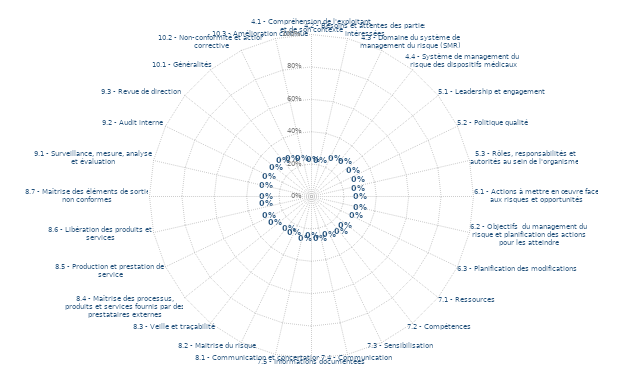
| Category | Sélectionnez | Résultats |
|---|---|---|
| 4.1 - Compréhension de l'exploitant et de son contexte | 0 | 0 |
| 4.2 - Besoins et attentes des parties intéressées | 0 | 0 |
| 4.3 - Domaine du système de management du risque (SMR) | 0 | 0 |
| 4.4 - Système de management du risque des dispositifs médicaux | 0 | 0 |
| 5.1 - Leadership et engagement | 0 | 0 |
| 5.2 - Politique qualité | 0 | 0 |
| 5.3 - Rôles, responsabilités et autorités au sein de l'organisme | 0 | 0 |
| 6.1 - Actions à mettre en œuvre face aux risques et opportunités | 0 | 0 |
| 6.2 - Objectifs  du management du risque et planification des actions pour les atteindre | 0 | 0 |
| 6.3 - Planification des modifications | 0 | 0 |
| 7.1 - Ressources | 0 | 0 |
| 7.2 - Compétences | 0 | 0 |
| 7.3 - Sensibilisation | 0 | 0 |
| 7.4 - Communication | 0 | 0 |
| 7.5 - Informations documentées | 0 | 0 |
| 8.1 - Communication et concertation | 0 | 0 |
| 8.2 - Maitrise du risque | 0 | 0 |
| 8.3 - Veille et traçabilité | 0 | 0 |
| 8.4 - Maîtrise des processus, produits et services fournis par des prestataires externes | 0 | 0 |
| 8.5 - Production et prestation de service | 0 | 0 |
| 8.6 - Libération des produits et services | 0 | 0 |
| 8.7 - Maîtrise des éléments de sortie non conformes | 0 | 0 |
| 9.1 - Surveillance, mesure, analyse et évaluation | 0 | 0 |
| 9.2 - Audit interne | 0 | 0 |
| 9.3 - Revue de direction | 0 | 0 |
| 10.1 - Généralités | 0 | 0 |
| 10.2 - Non-conformité et action corrective | 0 | 0 |
| 10.3 - Amélioration continue | 0 | 0 |